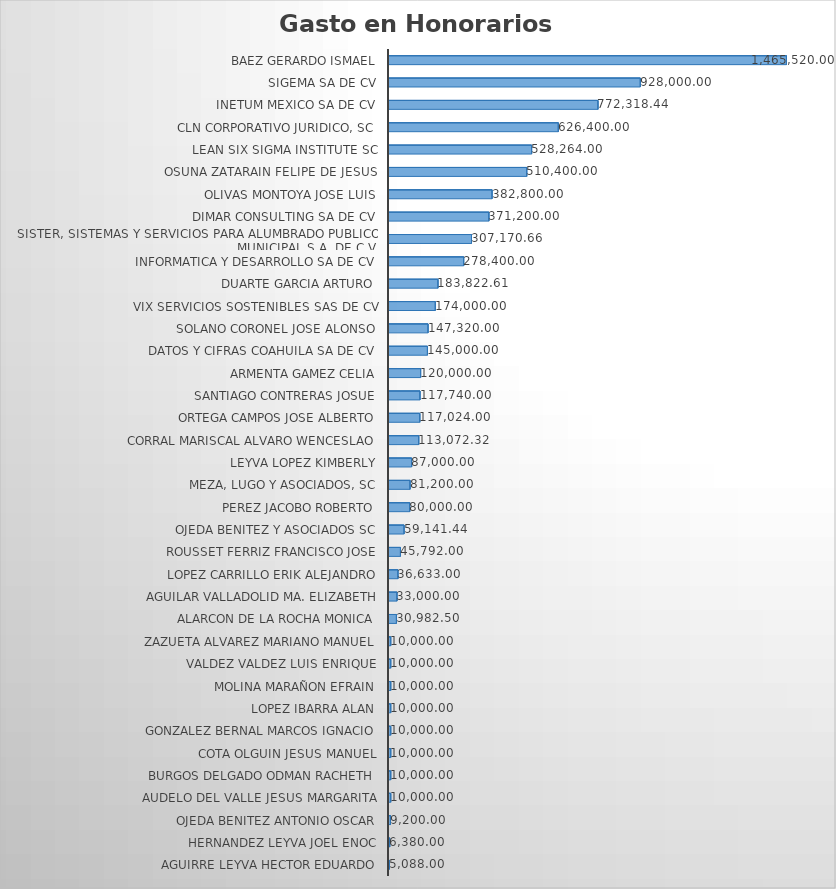
| Category | Suma |
|---|---|
| AGUIRRE LEYVA HECTOR EDUARDO | 5088 |
| HERNANDEZ LEYVA JOEL ENOC | 6380 |
| OJEDA BENITEZ ANTONIO OSCAR | 9200 |
| AUDELO DEL VALLE JESUS MARGARITA | 10000 |
| BURGOS DELGADO ODMAN RACHETH | 10000 |
| COTA OLGUIN JESUS MANUEL | 10000 |
| GONZALEZ BERNAL MARCOS IGNACIO | 10000 |
| LOPEZ IBARRA ALAN | 10000 |
| MOLINA MARAÑON EFRAIN | 10000 |
| VALDEZ VALDEZ LUIS ENRIQUE | 10000 |
| ZAZUETA ALVAREZ MARIANO MANUEL | 10000 |
| ALARCON DE LA ROCHA MONICA | 30982.5 |
| AGUILAR VALLADOLID MA. ELIZABETH | 33000 |
| LOPEZ CARRILLO ERIK ALEJANDRO | 36633 |
| ROUSSET FERRIZ FRANCISCO JOSE | 45792 |
| OJEDA BENITEZ Y ASOCIADOS SC | 59141.44 |
| PEREZ JACOBO ROBERTO | 80000 |
| MEZA, LUGO Y ASOCIADOS, SC | 81200 |
| LEYVA LOPEZ KIMBERLY | 87000 |
| CORRAL MARISCAL ALVARO WENCESLAO | 113072.32 |
| ORTEGA CAMPOS JOSE ALBERTO | 117024 |
| SANTIAGO CONTRERAS JOSUE | 117740 |
| ARMENTA GAMEZ CELIA | 120000 |
| DATOS Y CIFRAS COAHUILA SA DE CV | 145000 |
| SOLANO CORONEL JOSE ALONSO | 147320 |
| VIX SERVICIOS SOSTENIBLES SAS DE CV | 174000 |
| DUARTE GARCIA ARTURO | 183822.61 |
| INFORMATICA Y DESARROLLO SA DE CV | 278400 |
| SISTER, SISTEMAS Y SERVICIOS PARA ALUMBRADO PUBLICO MUNICIPAL,S.A. DE C.V. | 307170.66 |
| DIMAR CONSULTING SA DE CV | 371200 |
| OLIVAS MONTOYA JOSE LUIS | 382800 |
| OSUNA ZATARAIN FELIPE DE JESUS | 510400 |
| LEAN SIX SIGMA INSTITUTE SC | 528264 |
| CLN CORPORATIVO JURIDICO, SC | 626400 |
| INETUM MEXICO SA DE CV | 772318.44 |
| SIGEMA SA DE CV | 928000 |
| BAEZ GERARDO ISMAEL | 1465520 |